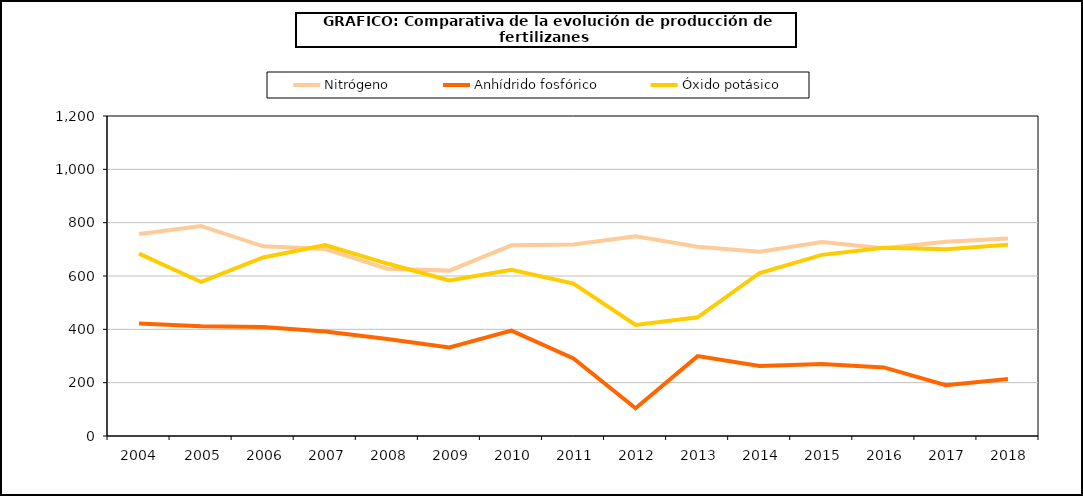
| Category | Nitrógeno | Anhídrido fosfórico | Óxido potásico |
|---|---|---|---|
|   2004  | 757.2 |  |  |
|   2005 | 787.7 |  |  |
|   2006 | 711.4 |  |  |
|   2007 | 701.022 |  |  |
|   2008 | 627.3 |  |  |
|   2009 | 620.2 |  |  |
|   2010 | 715 |  |  |
|   2011 | 718.1 |  |  |
|   2012 | 748.9 |  |  |
|   2013 | 710 |  |  |
|   2014 | 691.1 |  |  |
|   2015 | 727.2 |  |  |
|   2016 | 703.8 |  |  |
|   2017 | 728 |  |  |
|   2018 | 740.8 |  |  |